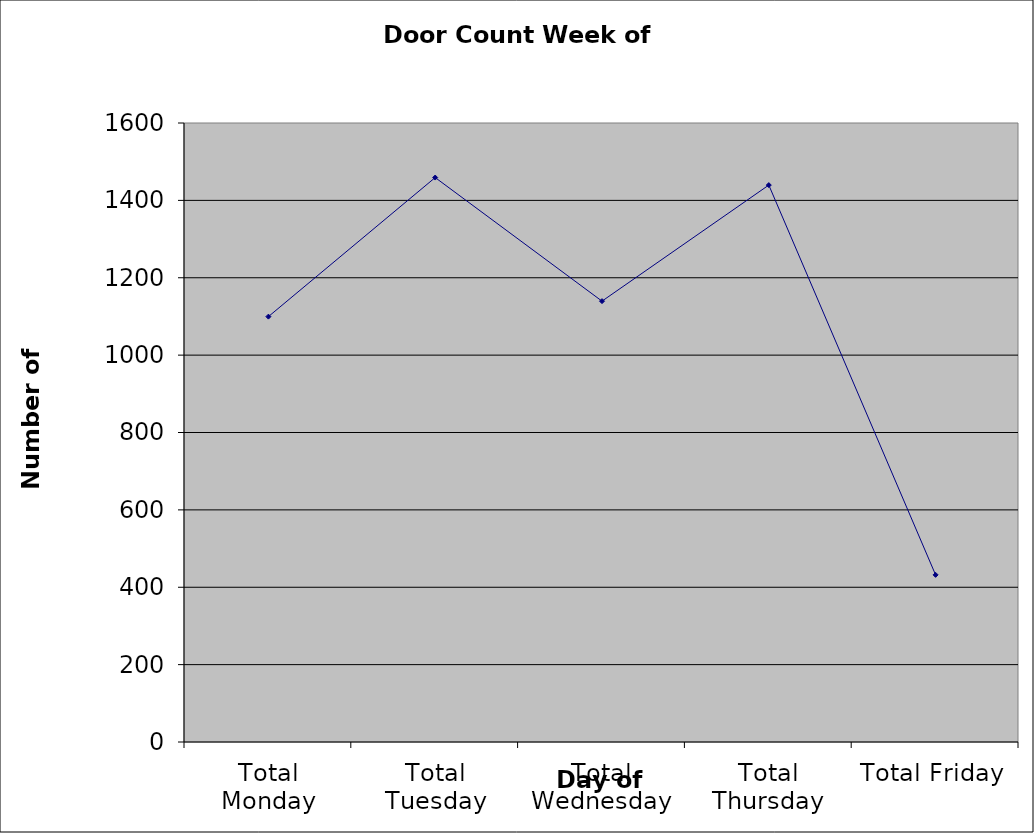
| Category | Series 0 |
|---|---|
| Total Monday | 1099.5 |
| Total Tuesday | 1459 |
| Total Wednesday | 1139.5 |
| Total Thursday | 1439.5 |
| Total Friday | 432 |